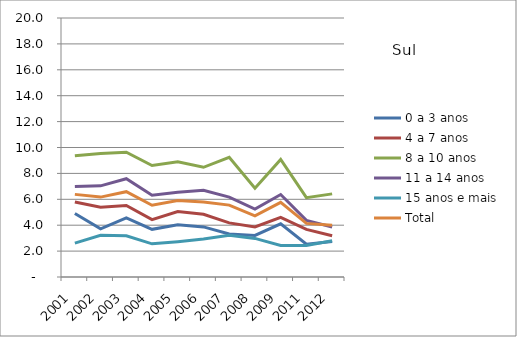
| Category | 0 a 3 anos | 4 a 7 anos | 8 a 10 anos | 11 a 14 anos | 15 anos e mais | Total |
|---|---|---|---|---|---|---|
| 2001.0 | 4.91 | 5.79 | 9.36 | 6.98 | 2.62 | 6.38 |
| 2002.0 | 3.72 | 5.38 | 9.53 | 7.04 | 3.22 | 6.17 |
| 2003.0 | 4.56 | 5.52 | 9.64 | 7.59 | 3.18 | 6.59 |
| 2004.0 | 3.68 | 4.43 | 8.61 | 6.31 | 2.56 | 5.54 |
| 2005.0 | 4.03 | 5.05 | 8.9 | 6.54 | 2.73 | 5.9 |
| 2006.0 | 3.87 | 4.84 | 8.47 | 6.69 | 2.93 | 5.79 |
| 2007.0 | 3.32 | 4.18 | 9.24 | 6.17 | 3.22 | 5.55 |
| 2008.0 | 3.21 | 3.87 | 6.86 | 5.25 | 2.98 | 4.72 |
| 2009.0 | 4.11 | 4.61 | 9.08 | 6.37 | 2.43 | 5.76 |
| 2011.0 | 2.53 | 3.68 | 6.13 | 4.37 | 2.43 | 4.14 |
| 2012.0 | 2.74 | 3.19 | 6.42 | 3.86 | 2.8 | 4 |